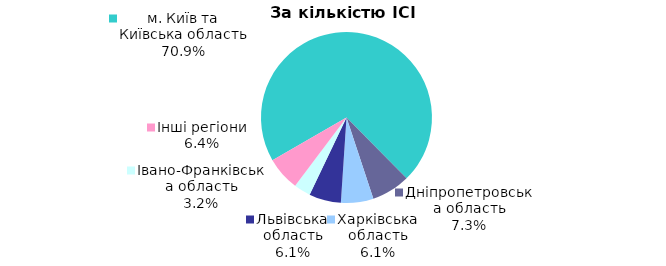
| Category | Series 0 |
|---|---|
| м. Київ та Київська область | 0.709 |
| Дніпропетровська область | 0.073 |
| Харківська область | 0.061 |
| Львівська область | 0.06 |
| Iвано-Франкiвська область | 0.032 |
| Інші регіони | 0.064 |